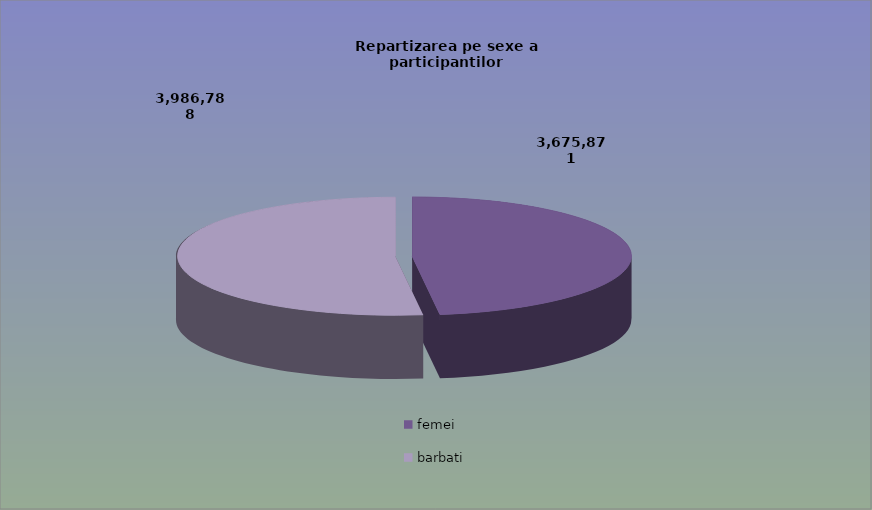
| Category | Series 0 |
|---|---|
| femei | 3675871 |
| barbati | 3986788 |